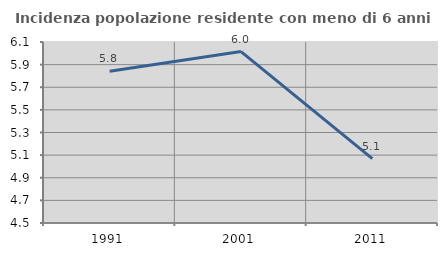
| Category | Incidenza popolazione residente con meno di 6 anni |
|---|---|
| 1991.0 | 5.842 |
| 2001.0 | 6.015 |
| 2011.0 | 5.068 |